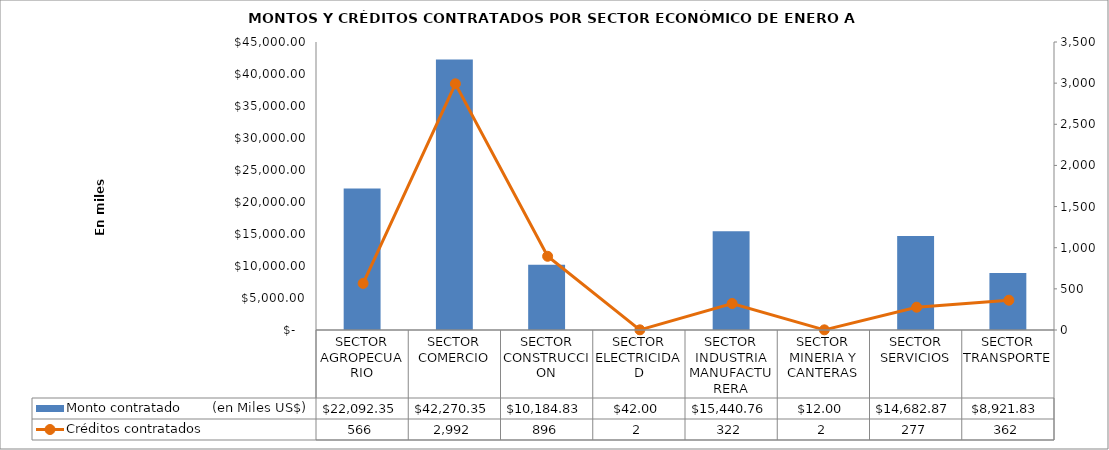
| Category | Monto contratado        (en Miles US$) |
|---|---|
| SECTOR AGROPECUARIO | 22092.353 |
| SECTOR COMERCIO | 42270.351 |
| SECTOR CONSTRUCCION | 10184.832 |
| SECTOR ELECTRICIDAD | 42 |
| SECTOR INDUSTRIA MANUFACTURERA | 15440.757 |
| SECTOR MINERIA Y CANTERAS | 12 |
| SECTOR SERVICIOS | 14682.87 |
| SECTOR TRANSPORTE | 8921.834 |